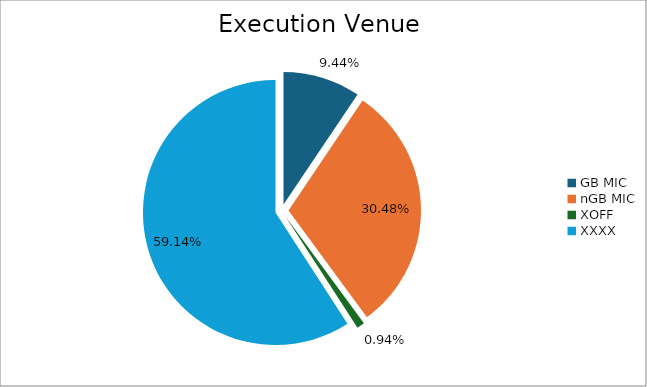
| Category | Series 0 |
|---|---|
| GB MIC | 1042031.531 |
| nGB MIC | 3365604.753 |
| XOFF | 103792.645 |
| XXXX | 6530545.195 |